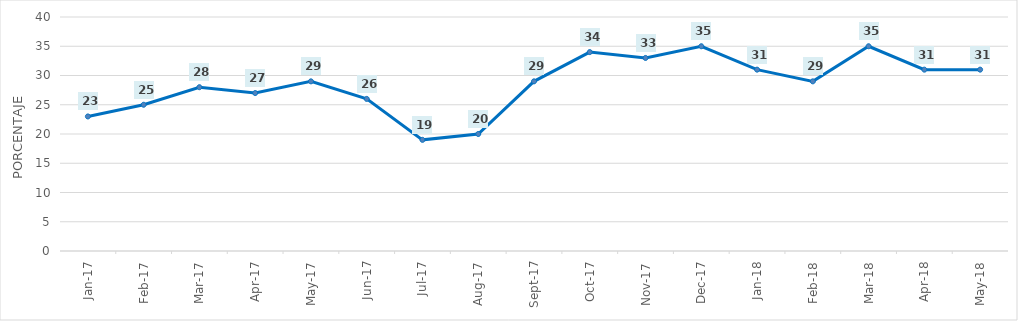
| Category | CAJAMARCA |
|---|---|
| 2017-01-01 | 23 |
| 2017-02-01 | 25 |
| 2017-03-01 | 28 |
| 2017-04-01 | 27 |
| 2017-05-01 | 29 |
| 2017-06-01 | 26 |
| 2017-07-01 | 19 |
| 2017-08-01 | 20 |
| 2017-09-01 | 29 |
| 2017-10-01 | 34 |
| 2017-11-01 | 33 |
| 2017-12-01 | 35 |
| 2018-01-01 | 31 |
| 2018-02-01 | 29 |
| 2018-03-01 | 35 |
| 2018-04-01 | 31 |
| 2018-05-01 | 31 |